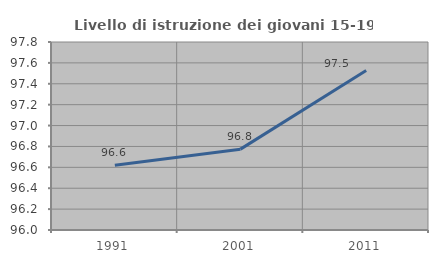
| Category | Livello di istruzione dei giovani 15-19 anni |
|---|---|
| 1991.0 | 96.619 |
| 2001.0 | 96.774 |
| 2011.0 | 97.527 |